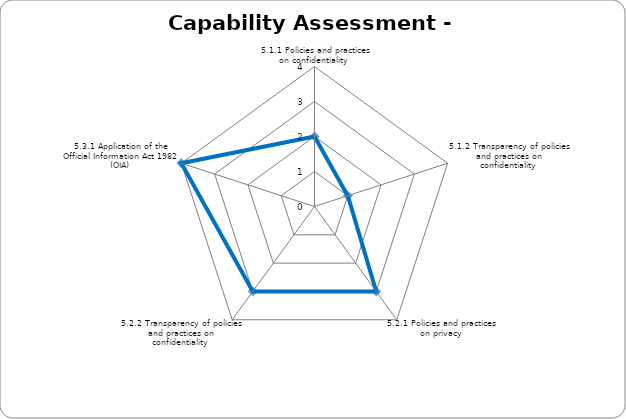
| Category | Series 0 |
|---|---|
|  5.1.1 Policies and practices on confidentiality | 2 |
| 5.1.2 Transparency of policies and practices on confidentiality  | 1 |
| 5.2.1 Policies and practices on privacy  | 3 |
| 5.2.2 Transparency of policies and practices on confidentiality  | 3 |
| 5.3.1 Application of the Official Information Act 1982 (OIA)  | 4 |